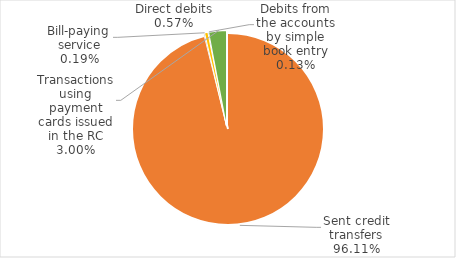
| Category | Total | Series 1 |
|---|---|---|
|  | 0 |  |
| Sent credit transfers | 2242048903642 |  |
| Bill-paying service | 4478590913 |  |
| Direct debits | 13274336766 |  |
| Debits from the accounts by simple book entry | 2962746537 |  |
| Transactions using payment cards issued in the RC | 69949173180 |  |